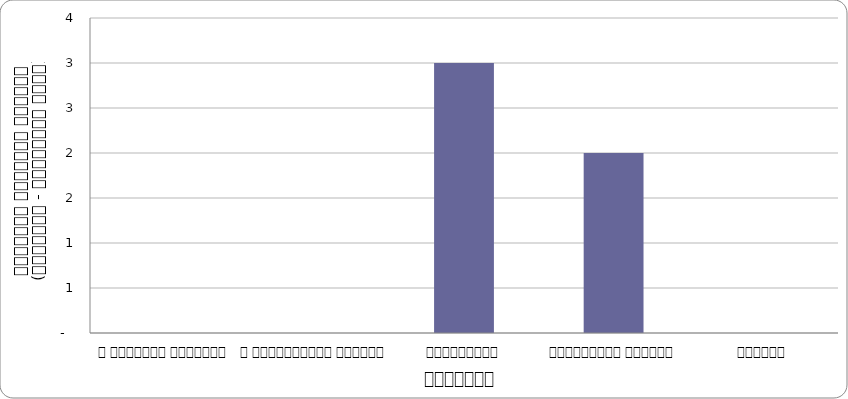
| Category | आन्दोलन |
|---|---|
| द हिमालयन टाइम्स् | 0 |
| द काठमाण्डौं पोस्ट् | 0 |
| कान्तिपुर | 3 |
| अन्नपूर्ण पोस्ट् | 2 |
| नागरिक | 0 |